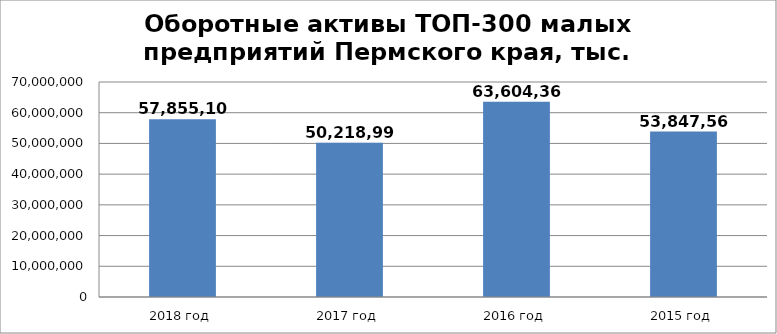
| Category | Series 0 |
|---|---|
| 2018 год | 57855102 |
| 2017 год | 50218998 |
| 2016 год | 63604360 |
| 2015 год | 53847565 |